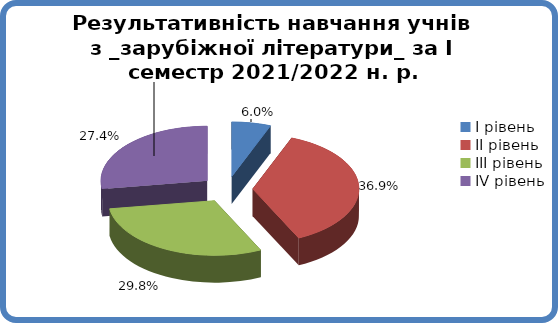
| Category | Series 0 |
|---|---|
| 0 | 0.06 |
| 1 | 0.369 |
| 2 | 0.298 |
| 3 | 0.274 |